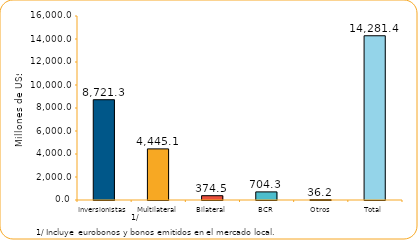
| Category | Series 1 |
|---|---|
| Inversionistas | 8721.3 |
| Multilateral | 4445.1 |
| Bilateral | 374.5 |
| BCR | 704.3 |
| Otros | 36.2 |
| Total | 14281.4 |